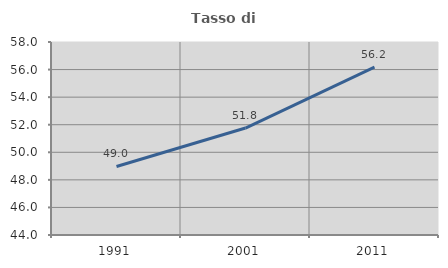
| Category | Tasso di occupazione   |
|---|---|
| 1991.0 | 48.973 |
| 2001.0 | 51.759 |
| 2011.0 | 56.171 |